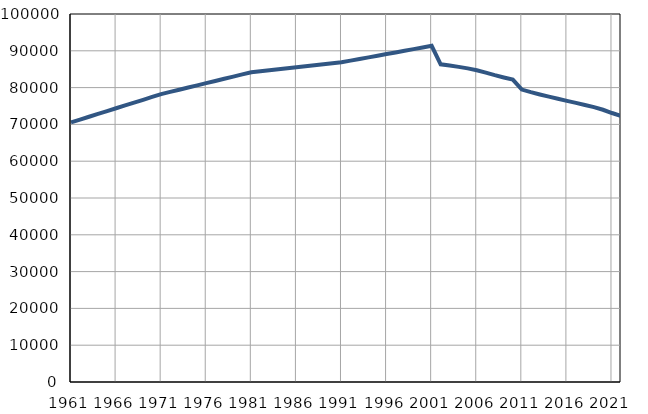
| Category | Population
size |
|---|---|
| 1961.0 | 70534 |
| 1962.0 | 71303 |
| 1963.0 | 72073 |
| 1964.0 | 72842 |
| 1965.0 | 73612 |
| 1966.0 | 74381 |
| 1967.0 | 75150 |
| 1968.0 | 75920 |
| 1969.0 | 76689 |
| 1970.0 | 77459 |
| 1971.0 | 78228 |
| 1972.0 | 78823 |
| 1973.0 | 79418 |
| 1974.0 | 80014 |
| 1975.0 | 80609 |
| 1976.0 | 81204 |
| 1977.0 | 81799 |
| 1978.0 | 82394 |
| 1979.0 | 82990 |
| 1980.0 | 83585 |
| 1981.0 | 84180 |
| 1982.0 | 84450 |
| 1983.0 | 84719 |
| 1984.0 | 84989 |
| 1985.0 | 85258 |
| 1986.0 | 85528 |
| 1987.0 | 85797 |
| 1988.0 | 86067 |
| 1989.0 | 86336 |
| 1990.0 | 86606 |
| 1991.0 | 86875 |
| 1992.0 | 87322 |
| 1993.0 | 87769 |
| 1994.0 | 88216 |
| 1995.0 | 88663 |
| 1996.0 | 89110 |
| 1997.0 | 89556 |
| 1998.0 | 90003 |
| 1999.0 | 90450 |
| 2000.0 | 90897 |
| 2001.0 | 91344 |
| 2002.0 | 86326 |
| 2003.0 | 85978 |
| 2004.0 | 85631 |
| 2005.0 | 85219 |
| 2006.0 | 84725 |
| 2007.0 | 84074 |
| 2008.0 | 83374 |
| 2009.0 | 82749 |
| 2010.0 | 82157 |
| 2011.0 | 79456 |
| 2012.0 | 78758 |
| 2013.0 | 78136 |
| 2014.0 | 77543 |
| 2015.0 | 76958 |
| 2016.0 | 76390 |
| 2017.0 | 75846 |
| 2018.0 | 75286 |
| 2019.0 | 74703 |
| 2020.0 | 73975 |
| 2021.0 | 73089 |
| 2022.0 | 72319 |